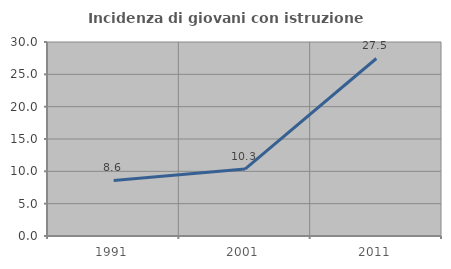
| Category | Incidenza di giovani con istruzione universitaria |
|---|---|
| 1991.0 | 8.594 |
| 2001.0 | 10.345 |
| 2011.0 | 27.451 |